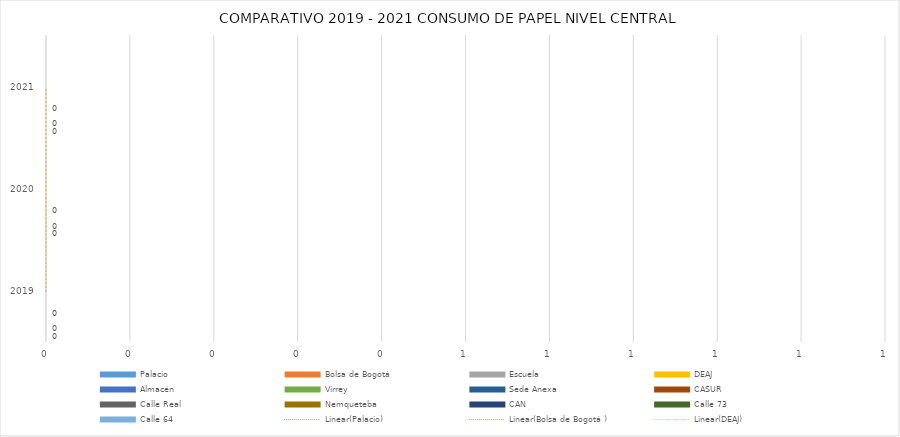
| Category | Palacio | Bolsa de Bogotá  | Escuela | DEAJ | Almacén | Virrey | Sede Anexa | CASUR | Calle Real | Nemqueteba | CAN | Calle 73 | Calle 64 |
|---|---|---|---|---|---|---|---|---|---|---|---|---|---|
| 0 | 0 | 0 | 0 | 0 | 0 | 0 | 0 | 0 | 0 | 0 | 0 | 0 | 0 |
| 1 | 0 | 0 | 0 | 0 | 0 | 0 | 0 | 0 | 0 | 0 | 0 | 0 | 0 |
| 2 | 0 | 0 | 0 | 0 | 0 | 0 | 0 | 0 | 0 | 0 | 0 | 0 | 0 |